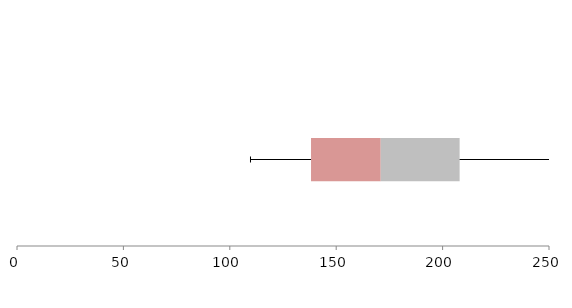
| Category | Series 1 | Series 2 | Series 3 |
|---|---|---|---|
| 0 | 138.169 | 32.761 | 37.074 |